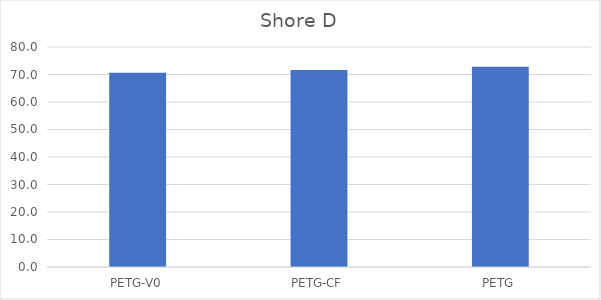
| Category | Shore D |
|---|---|
| PETG-V0 | 70.667 |
| PETG-CF | 71.667 |
| PETG | 72.833 |